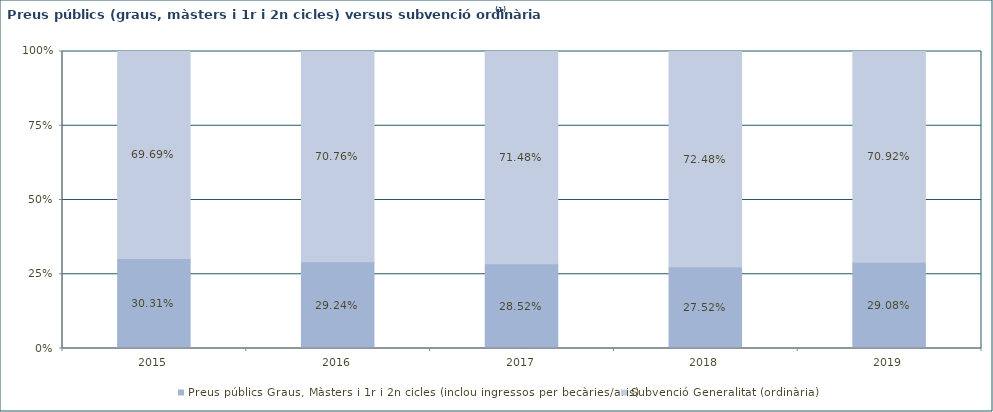
| Category | Preus públics Graus, Màsters i 1r i 2n cicles (inclou ingressos per becàries/aris) | Subvenció Generalitat (ordinària) |
|---|---|---|
| 2015.0 | 0.303 | 0.697 |
| 2016.0 | 0.292 | 0.708 |
| 2017.0 | 0.285 | 0.715 |
| 2018.0 | 0.275 | 0.725 |
| 2019.0 | 0.291 | 0.709 |